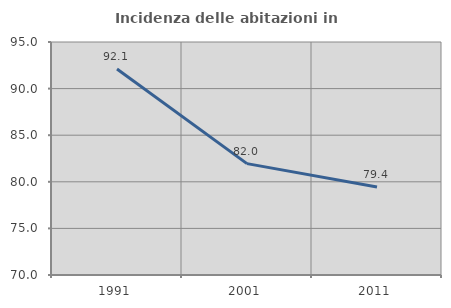
| Category | Incidenza delle abitazioni in proprietà  |
|---|---|
| 1991.0 | 92.1 |
| 2001.0 | 81.953 |
| 2011.0 | 79.433 |